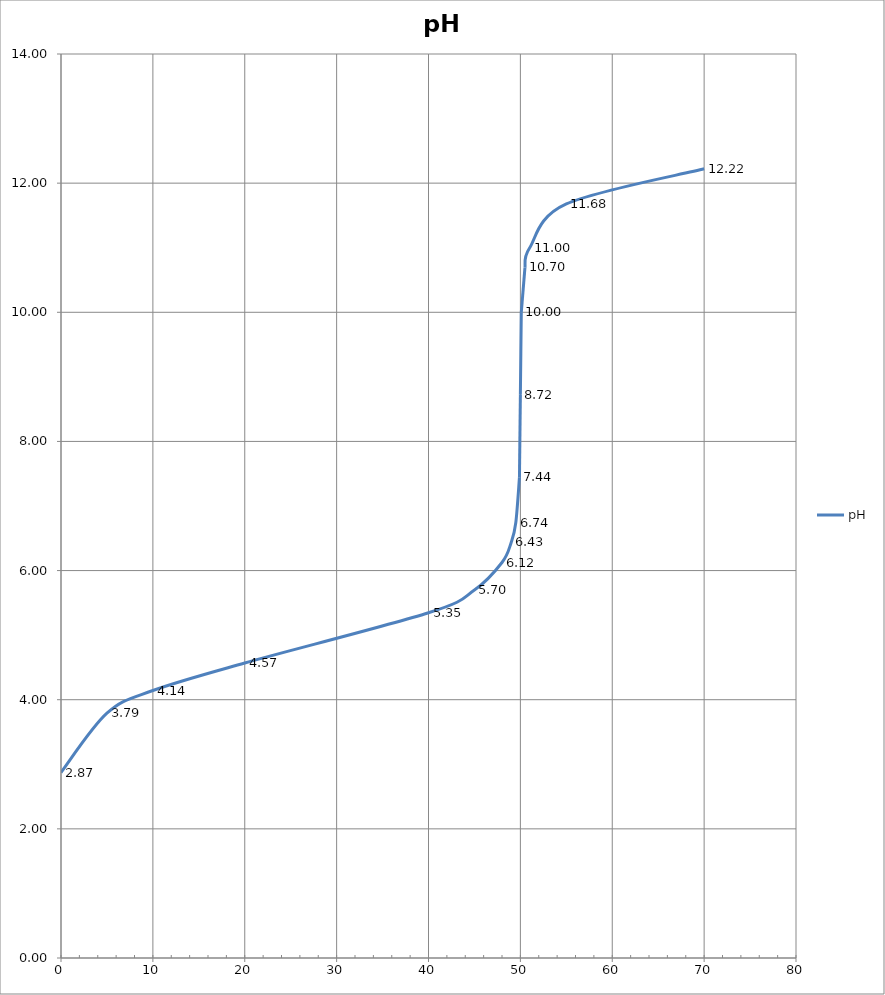
| Category | pH |
|---|---|
| 0.0 | 2.872 |
| 5.0 | 3.79 |
| 10.0 | 4.143 |
| 20.0 | 4.569 |
| 40.0 | 5.347 |
| 45.0 | 5.699 |
| 48.0 | 6.125 |
| 49.0 | 6.435 |
| 49.5 | 6.74 |
| 49.9 | 7.443 |
| 50.0 | 8.722 |
| 50.1 | 10 |
| 50.5 | 10.697 |
| 51.0 | 10.996 |
| 55.0 | 11.678 |
| 70.0 | 12.222 |